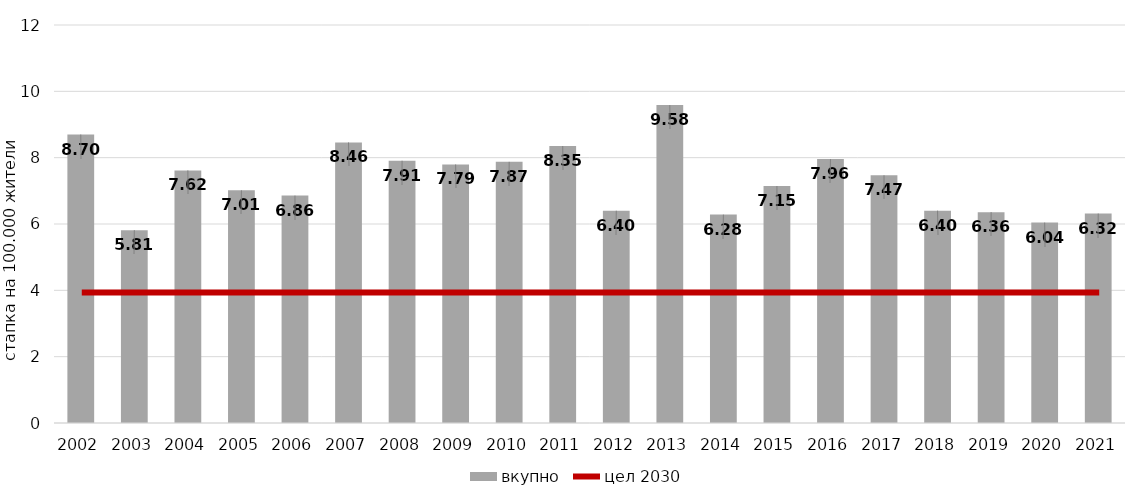
| Category | вкупно |
|---|---|
| 2002.0 | 8.697 |
| 2003.0 | 5.813 |
| 2004.0 | 7.616 |
| 2005.0 | 7.015 |
| 2006.0 | 6.856 |
| 2007.0 | 8.459 |
| 2008.0 | 7.908 |
| 2009.0 | 7.795 |
| 2010.0 | 7.874 |
| 2011.0 | 8.35 |
| 2012.0 | 6.401 |
| 2013.0 | 9.585 |
| 2014.0 | 6.283 |
| 2015.0 | 7.145 |
| 2016.0 | 7.957 |
| 2017.0 | 7.469 |
| 2018.0 | 6.403 |
| 2019.0 | 6.358 |
| 2020.0 | 6.043 |
| 2021.0 | 6.316 |